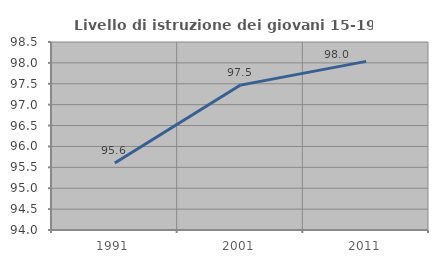
| Category | Livello di istruzione dei giovani 15-19 anni |
|---|---|
| 1991.0 | 95.604 |
| 2001.0 | 97.468 |
| 2011.0 | 98.036 |